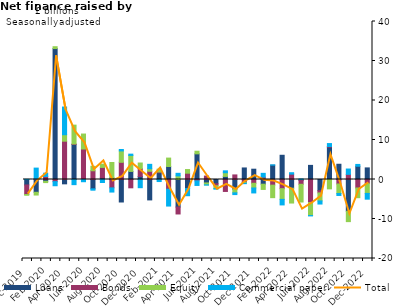
| Category | Loans | Bonds | Equity | Commercial paper |
|---|---|---|---|---|
| Dec-2019 | -1.383 | -2.415 | -0.197 | 0.031 |
| Jan-2020 | -3.238 | 0.155 | -0.694 | 2.731 |
| Feb-2020 | -0.447 | 0.764 | -0.339 | 0.826 |
| Mar-2020 | 33.152 | -0.54 | 0.465 | -1.041 |
| Apr-2020 | -1.099 | 9.698 | 1.637 | 7.014 |
| May-2020 | 8.86 | 0.131 | 4.771 | -1.303 |
| Jun-2020 | 0.225 | 7.494 | 3.791 | -0.564 |
| Jul-2020 | -2.366 | 2.212 | 1.131 | -0.34 |
| Aug-2020 | 0.446 | 2.614 | 0.823 | -0.762 |
| Sep-2020 | 0.416 | -2.122 | 3.892 | -1.058 |
| Oct-2020 | -5.695 | 4.349 | 2.882 | 0.366 |
| Nov-2020 | 2.044 | -2.106 | 4.048 | 0.327 |
| Dec-2020 | 0.758 | 2.015 | 1.401 | -2.076 |
| Jan-2021 | -5.167 | 2.081 | 0.647 | 1.11 |
| Feb-2021 | 1.71 | 0.193 | 0.712 | -0.517 |
| Mar-2021 | 3.286 | -2.452 | 2.135 | -4.272 |
| Apr-2021 | -6.974 | -1.754 | 0.916 | 0.65 |
| May-2021 | -2.289 | 1.596 | 0.921 | -1.817 |
| Jun-2021 | 6.496 | -0.338 | 0.664 | -1.166 |
| Jul-2021 | -0.868 | 0.867 | -0.483 | -0.072 |
| Aug-2021 | -1.081 | -0.499 | -0.722 | -0.136 |
| Sep-2021 | 0.784 | -3.026 | 0.928 | 0.481 |
| Oct-2021 | -2.473 | 1.158 | -0.904 | -0.446 |
| Nov-2021 | 2.921 | -0.729 | -0.221 | -0.107 |
| Dec-2021 | 2.608 | -0.957 | -1.192 | -1.25 |
| Jan-2022 | -1.187 | 0.598 | -1.326 | 0.961 |
| Feb-2022 | 3.637 | -1.431 | -3.166 | 0.058 |
| Mar-2022 | 6.134 | -2.323 | -2.708 | -1.403 |
| Apr-2022 | -2.199 | 1.362 | -3.759 | 0.359 |
| May-2022 | -0.269 | -0.942 | -4.486 | 0.142 |
| Jun-2022 | 3.576 | -5.816 | -3.316 | -0.081 |
| Jul-2022 | -2.844 | -0.555 | -2.024 | -0.789 |
| Aug-2022 | 8.184 | 0.173 | -2.371 | 0.742 |
| Sep-2022 | 3.859 | -1.135 | -2.413 | -0.495 |
| Oct-2022 | -8.042 | 1.304 | -2.624 | 1.347 |
| Nov-2022 | 3.357 | -2.15 | -2.455 | 0.46 |
| Dec-2022 | 2.936 | -1.032 | -2.491 | -1.457 |